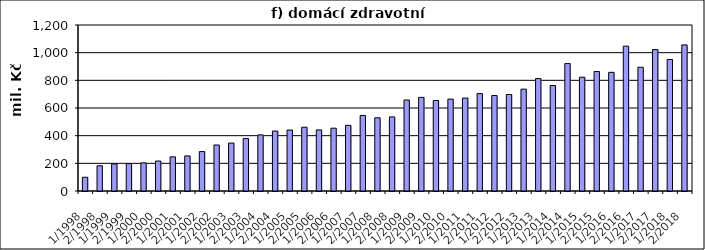
| Category | Series 0 |
|---|---|
| 1/1998 | 99503.525 |
| 2/1998 | 182478.574 |
| 1/1999 | 195637.487 |
| 2/1999 | 197784.513 |
| 1/2000 | 203130.806 |
| 2/2000 | 216595.714 |
| 1/2001 | 246770.432 |
| 2/2001 | 253465.034 |
| 1/2002 | 284952 |
| 2/2002 | 332450 |
| 1/2003 | 346564 |
| 2/2003 | 378803.651 |
| 1/2004 | 405611.977 |
| 2/2004 | 433177.909 |
| 1/2005 | 440657 |
| 2/2005 | 460948.86 |
| 1/2006 | 441353 |
| 2/2006 | 454133 |
| 1/2007 | 474776 |
| 2/2007 | 546385 |
| 1/2008 | 529021.704 |
| 2/2008 | 535716.296 |
| 1/2009 | 657761 |
| 2/2009 | 676757 |
| 1/2010 | 654495 |
| 2/2010 | 664470 |
| 1/2011 | 671830 |
| 2/2011 | 704189 |
| 1/2012 | 690049 |
| 2/2012 | 697526 |
| 1/2013 | 736355 |
| 2/2013 | 812775 |
| 1/2014 | 762751 |
| 2/2014 | 921108 |
| 1/2015 | 822410 |
| 2/2015 | 863655 |
| 1/2016 | 857778 |
| 2/2016 | 1047131 |
| 1/2017 | 894514 |
| 2/2017 | 1022106 |
| 1/2018 | 950601.065 |
| 2/2018 | 1056146.177 |